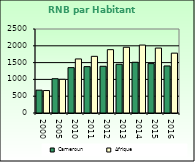
| Category | Cameroun | Afrique                        |
|---|---|---|
| 2000.0 | 680 | 668.557 |
| 2005.0 | 1020 | 1002.896 |
| 2010.0 | 1350 | 1608.999 |
| 2011.0 | 1380 | 1686.521 |
| 2012.0 | 1390 | 1885.129 |
| 2013.0 | 1450 | 1956.671 |
| 2014.0 | 1510 | 2022.289 |
| 2015.0 | 1470 | 1932.283 |
| 2016.0 | 1400 | 1781.415 |